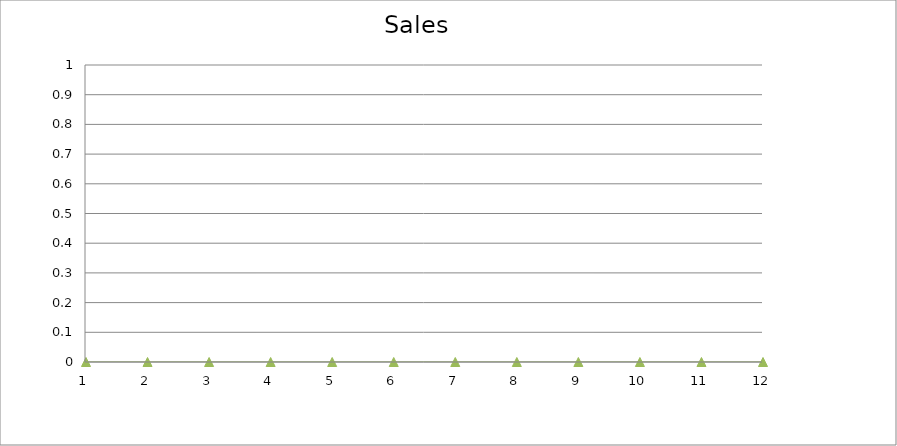
| Category | Actual |
|---|---|
| 0 | 2880 |
| 1 | 3440 |
| 2 | 2460 |
| 3 | 2280 |
| 4 | 3050 |
| 5 | 2890 |
| 6 | 1870 |
| 7 | 1950 |
| 8 | 1110 |
| 9 | 1500 |
| 10 | 600 |
| 11 | 1910 |